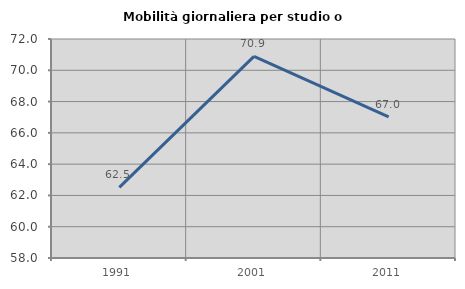
| Category | Mobilità giornaliera per studio o lavoro |
|---|---|
| 1991.0 | 62.513 |
| 2001.0 | 70.889 |
| 2011.0 | 67.023 |